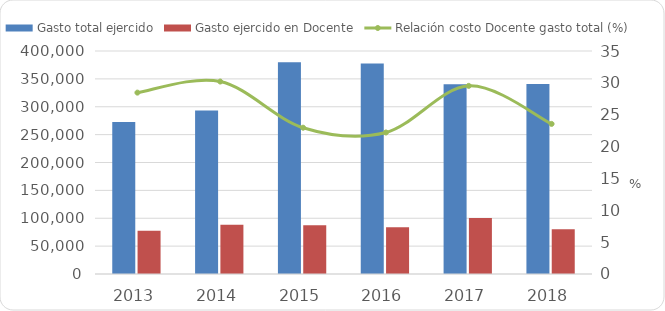
| Category | Gasto total ejercido | Gasto ejercido en Docente |
|---|---|---|
| 2013 | 272702.822 | 77627.479 |
| 2014 | 293113.7 | 88540.243 |
| 2015 | 380021.6 | 87260.674 |
| 2016 | 377416.6 | 83826.519 |
| 2017 | 340334.7 | 100494.157 |
| 2018 | 340765 | 80275.926 |